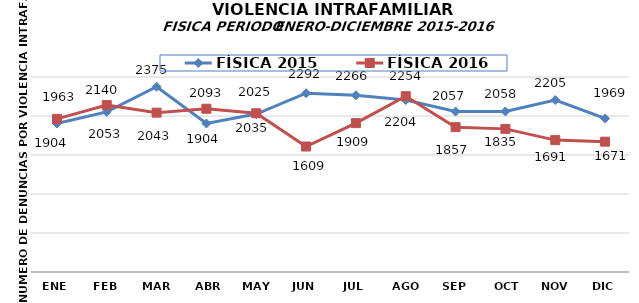
| Category | FÍSICA 2015 | FÍSICA 2016 |
|---|---|---|
| ENE | 1904 | 1963 |
| FEB | 2053 | 2140 |
| MAR | 2375 | 2043 |
| ABR | 1904 | 2093 |
| MAY | 2025 | 2035 |
| JUN | 2292 | 1609 |
| JUL | 2266 | 1909 |
| AGO | 2204 | 2254 |
| SEP | 2057 | 1857 |
| OCT | 2058 | 1835 |
| NOV | 2205 | 1691 |
| DIC | 1969 | 1671 |